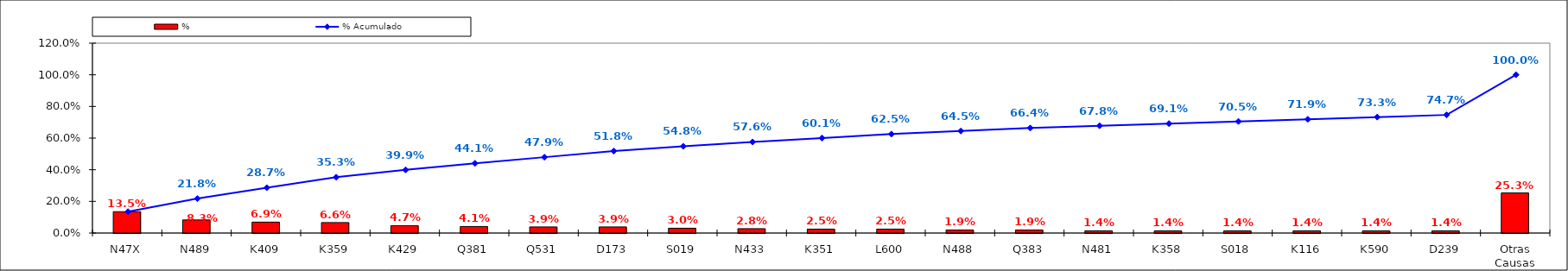
| Category | % |
|---|---|
| N47X | 0.135 |
| N489 | 0.083 |
| K409 | 0.069 |
| K359 | 0.066 |
| K429 | 0.047 |
| Q381 | 0.041 |
| Q531 | 0.039 |
| D173 | 0.039 |
| S019 | 0.03 |
| N433 | 0.028 |
| K351 | 0.025 |
| L600 | 0.025 |
| N488 | 0.019 |
| Q383 | 0.019 |
| N481 | 0.014 |
| K358 | 0.014 |
| S018 | 0.014 |
| K116 | 0.014 |
| K590 | 0.014 |
| D239 | 0.014 |
| Otras Causas | 0.253 |